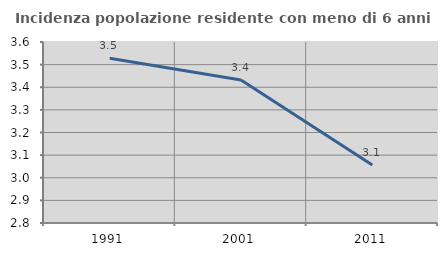
| Category | Incidenza popolazione residente con meno di 6 anni |
|---|---|
| 1991.0 | 3.528 |
| 2001.0 | 3.432 |
| 2011.0 | 3.056 |